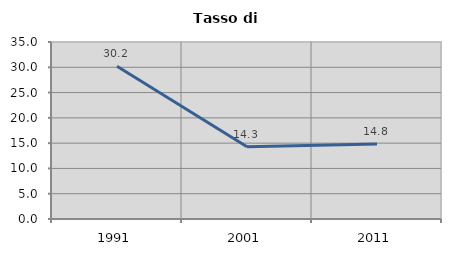
| Category | Tasso di disoccupazione   |
|---|---|
| 1991.0 | 30.189 |
| 2001.0 | 14.286 |
| 2011.0 | 14.839 |